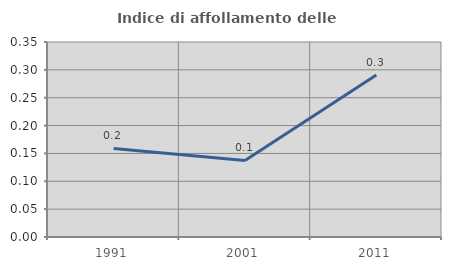
| Category | Indice di affollamento delle abitazioni  |
|---|---|
| 1991.0 | 0.159 |
| 2001.0 | 0.137 |
| 2011.0 | 0.291 |